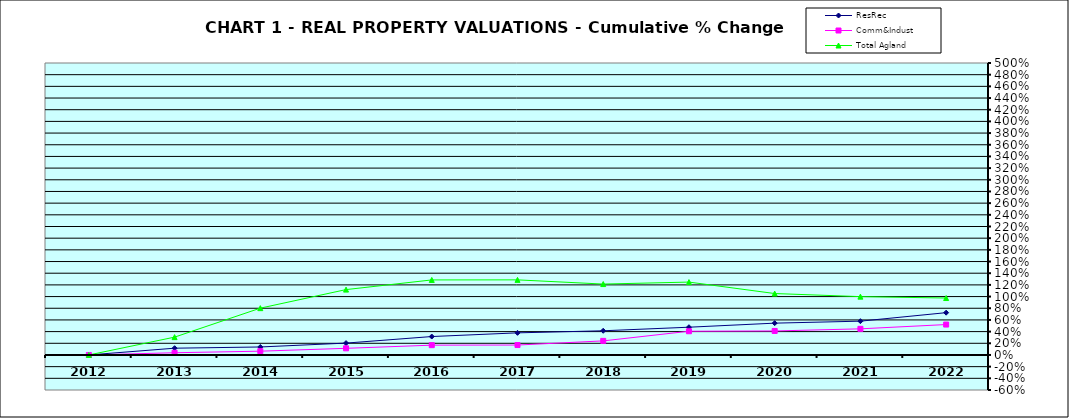
| Category | ResRec | Comm&Indust | Total Agland |
|---|---|---|---|
| 2012.0 | 0 | 0 | 0 |
| 2013.0 | 0.116 | 0.038 | 0.305 |
| 2014.0 | 0.137 | 0.065 | 0.802 |
| 2015.0 | 0.203 | 0.114 | 1.119 |
| 2016.0 | 0.315 | 0.168 | 1.285 |
| 2017.0 | 0.379 | 0.17 | 1.286 |
| 2018.0 | 0.414 | 0.241 | 1.214 |
| 2019.0 | 0.475 | 0.406 | 1.248 |
| 2020.0 | 0.545 | 0.411 | 1.052 |
| 2021.0 | 0.579 | 0.447 | 0.999 |
| 2022.0 | 0.724 | 0.521 | 0.975 |